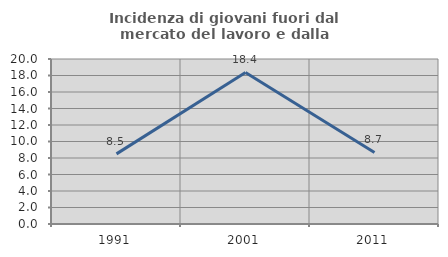
| Category | Incidenza di giovani fuori dal mercato del lavoro e dalla formazione  |
|---|---|
| 1991.0 | 8.502 |
| 2001.0 | 18.367 |
| 2011.0 | 8.673 |